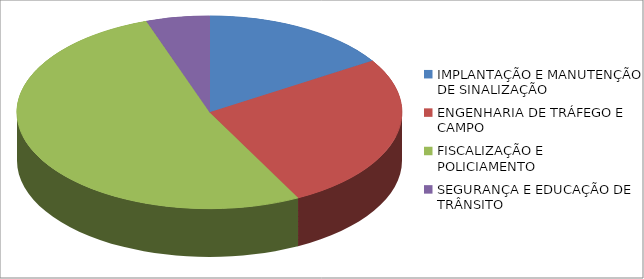
| Category | Series 0 | Series 1 |
|---|---|---|
| IMPLANTAÇÃO E MANUTENÇÃO DE SINALIZAÇÃO | 1075754.8 |  |
| ENGENHARIA DE TRÁFEGO E CAMPO | 1769709.65 |  |
| FISCALIZAÇÃO E POLICIAMENTO | 3509452.19 |  |
| SEGURANÇA E EDUCAÇÃO DE TRÂNSITO | 356980.71 |  |